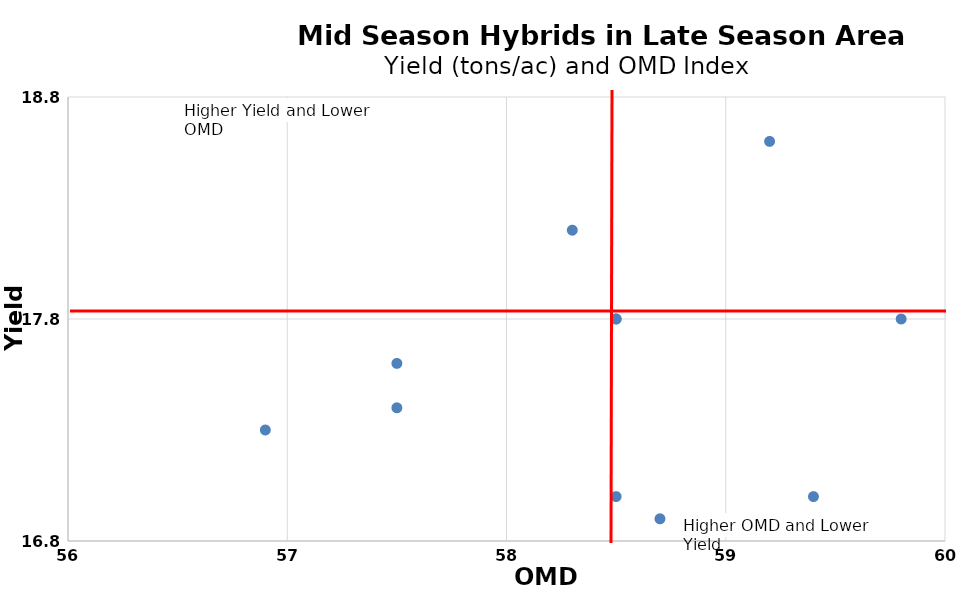
| Category | Series 0 |
|---|---|
| 59.2 | 18.6 |
| 58.3 | 18.2 |
| 56.9 | 17.3 |
| 58.5 | 17 |
| 57.5 | 17.4 |
| 58.7 | 16.9 |
| 58.5 | 17.8 |
| 59.8 | 17.8 |
| 59.4 | 17 |
| 57.5 | 17.6 |
| 58.5 | 17.8 |